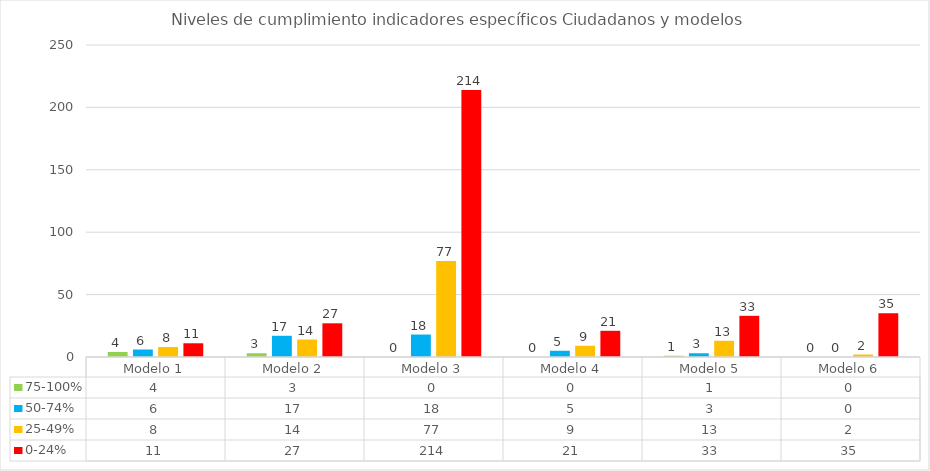
| Category | 75-100% | 50-74% | 25-49% | 0-24% |
|---|---|---|---|---|
| Modelo 1 | 4 | 6 | 8 | 11 |
| Modelo 2 | 3 | 17 | 14 | 27 |
| Modelo 3 | 0 | 18 | 77 | 214 |
| Modelo 4 | 0 | 5 | 9 | 21 |
| Modelo 5 | 1 | 3 | 13 | 33 |
| Modelo 6 | 0 | 0 | 2 | 35 |